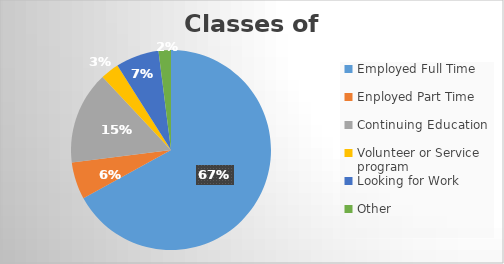
| Category | Series 0 |
|---|---|
| Employed Full Time | 67 |
| Enployed Part Time | 6 |
| Continuing Education | 15 |
| Volunteer or Service program  | 3 |
| Looking for Work | 7 |
| Other | 2 |